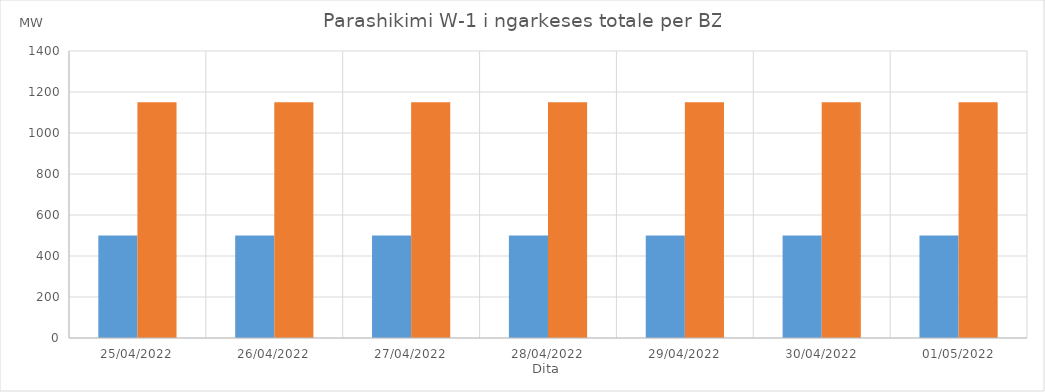
| Category | Min (MW) | Max (MW) |
|---|---|---|
| 25/04/2022 | 500 | 1150 |
| 26/04/2022 | 500 | 1150 |
| 27/04/2022 | 500 | 1150 |
| 28/04/2022 | 500 | 1150 |
| 29/04/2022 | 500 | 1150 |
| 30/04/2022 | 500 | 1150 |
| 01/05/2022 | 500 | 1150 |